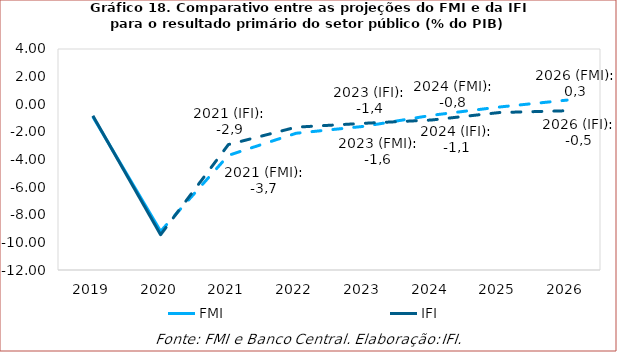
| Category | FMI | IFI |
|---|---|---|
| 2019.0 | -0.9 | -0.84 |
| 2020.0 | -9.2 | -9.44 |
| 2021.0 | -3.7 | -2.92 |
| 2022.0 | -2.1 | -1.66 |
| 2023.0 | -1.6 | -1.38 |
| 2024.0 | -0.8 | -1.14 |
| 2025.0 | -0.2 | -0.6 |
| 2026.0 | 0.3 | -0.47 |